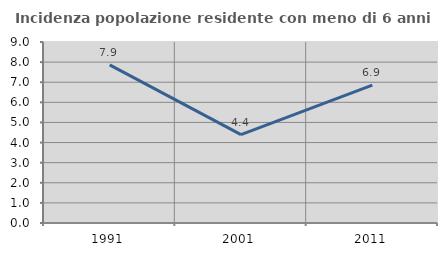
| Category | Incidenza popolazione residente con meno di 6 anni |
|---|---|
| 1991.0 | 7.859 |
| 2001.0 | 4.393 |
| 2011.0 | 6.857 |